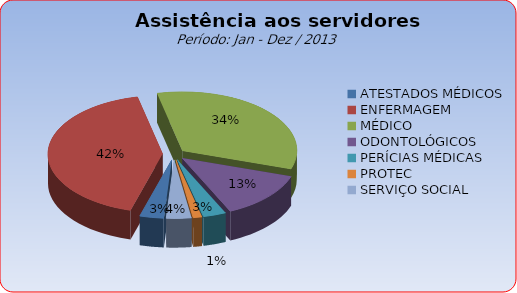
| Category | Series 0 |
|---|---|
| ATESTADOS MÉDICOS | 3.395 |
| ENFERMAGEM | 41.967 |
| MÉDICO | 33.6 |
| ODONTOLÓGICOS | 13.047 |
| PERÍCIAS MÉDICAS | 3.225 |
| PROTEC | 1.249 |
| SERVIÇO SOCIAL | 3.516 |